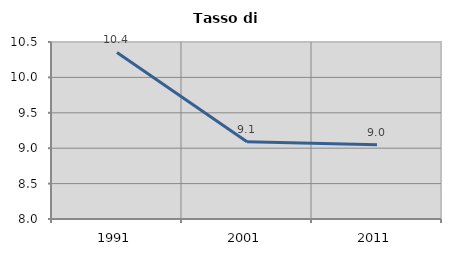
| Category | Tasso di disoccupazione   |
|---|---|
| 1991.0 | 10.352 |
| 2001.0 | 9.091 |
| 2011.0 | 9.05 |